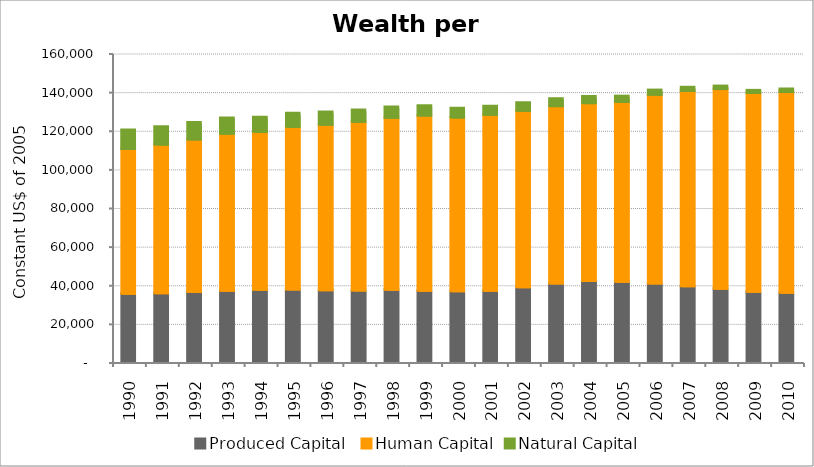
| Category | Produced Capital  | Human Capital | Natural Capital |
|---|---|---|---|
| 1990.0 | 35304.936 | 74984.323 | 9837.136 |
| 1991.0 | 35638.578 | 76929.795 | 9250.241 |
| 1992.0 | 36229.324 | 79038.226 | 8702.178 |
| 1993.0 | 36851.874 | 81399.535 | 8122.554 |
| 1994.0 | 37427.38 | 81732.112 | 7558.473 |
| 1995.0 | 37545.555 | 84207.992 | 7031.199 |
| 1996.0 | 37130.003 | 85755.64 | 6543.114 |
| 1997.0 | 37024.818 | 87403.261 | 6016.208 |
| 1998.0 | 37425.192 | 89060.857 | 5543.303 |
| 1999.0 | 36862.75 | 90711.696 | 5115.985 |
| 2000.0 | 36688.554 | 89918.036 | 4739.4 |
| 2001.0 | 36940.853 | 91027.368 | 4430.764 |
| 2002.0 | 38675.513 | 91445.194 | 4157.071 |
| 2003.0 | 40645.101 | 91830.11 | 3847.619 |
| 2004.0 | 41912.658 | 92113.422 | 3438.083 |
| 2005.0 | 41572.153 | 93123.082 | 2953.024 |
| 2006.0 | 40663.426 | 97709.57 | 2424.691 |
| 2007.0 | 39277.466 | 101037.491 | 1938.426 |
| 2008.0 | 37986.906 | 103343.789 | 1540.834 |
| 2009.0 | 36317.156 | 103034.804 | 1238.529 |
| 2010.0 | 35852.234 | 104217.649 | 1016.87 |